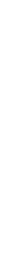
| Category | 2018 | 2019 |
|---|---|---|
| الشركة الجزائرية لتأمين وضمان الصادرات | 6.923 | 10.476 |
| صندوق ضمان صادرات إيران | 3.358 | 7.789 |
| بنك التصدير والاستيراد التركي | 1.857 | 1.592 |
| باقي الأعضاء | 1.4 | 1.6 |